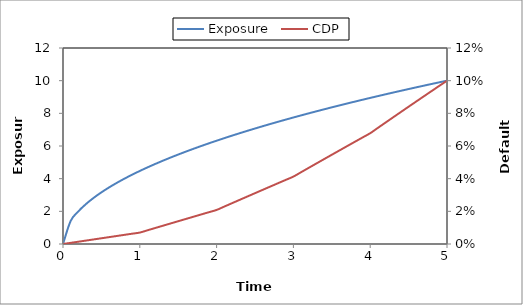
| Category | Exposure |
|---|---|
| 0.0 | 0 |
| 0.1 | 1.414 |
| 0.2 | 2 |
| 0.30000000000000004 | 2.449 |
| 0.4 | 2.828 |
| 0.5 | 3.162 |
| 0.6 | 3.464 |
| 0.7 | 3.742 |
| 0.7999999999999999 | 4 |
| 0.8999999999999999 | 4.243 |
| 0.9999999999999999 | 4.472 |
| 1.0999999999999999 | 4.69 |
| 1.2 | 4.899 |
| 1.3 | 5.099 |
| 1.4000000000000001 | 5.292 |
| 1.5000000000000002 | 5.477 |
| 1.6000000000000003 | 5.657 |
| 1.7000000000000004 | 5.831 |
| 1.8000000000000005 | 6 |
| 1.9000000000000006 | 6.164 |
| 2.0000000000000004 | 6.325 |
| 2.1000000000000005 | 6.481 |
| 2.2000000000000006 | 6.633 |
| 2.3000000000000007 | 6.782 |
| 2.400000000000001 | 6.928 |
| 2.500000000000001 | 7.071 |
| 2.600000000000001 | 7.211 |
| 2.700000000000001 | 7.348 |
| 2.800000000000001 | 7.483 |
| 2.9000000000000012 | 7.616 |
| 3.0000000000000013 | 7.746 |
| 3.1000000000000014 | 7.874 |
| 3.2000000000000015 | 8 |
| 3.3000000000000016 | 8.124 |
| 3.4000000000000017 | 8.246 |
| 3.5000000000000018 | 8.367 |
| 3.600000000000002 | 8.485 |
| 3.700000000000002 | 8.602 |
| 3.800000000000002 | 8.718 |
| 3.900000000000002 | 8.832 |
| 4.000000000000002 | 8.944 |
| 4.100000000000001 | 9.055 |
| 4.200000000000001 | 9.165 |
| 4.300000000000001 | 9.274 |
| 4.4 | 9.381 |
| 4.5 | 9.487 |
| 4.6 | 9.592 |
| 4.699999999999999 | 9.695 |
| 4.799999999999999 | 9.798 |
| 4.899999999999999 | 9.899 |
| 4.999999999999998 | 10 |